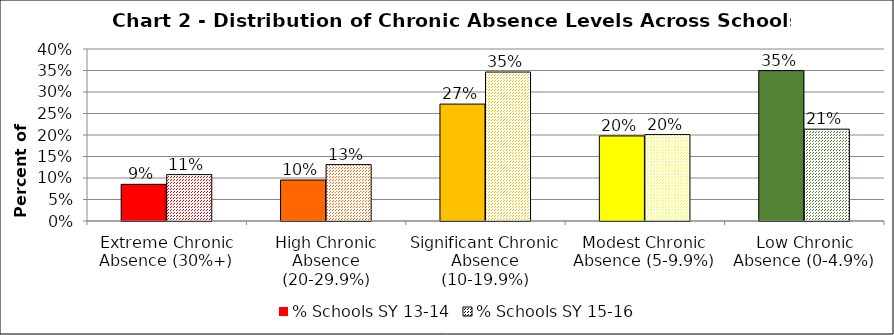
| Category | % Schools SY 13-14 | % Schools SY 15-16 |
|---|---|---|
| Extreme Chronic Absence (30%+) | 0.085 | 0.108 |
| High Chronic Absence (20-29.9%) | 0.095 | 0.131 |
| Significant Chronic Absence (10-19.9%) | 0.272 | 0.346 |
| Modest Chronic Absence (5-9.9%) | 0.198 | 0.201 |
| Low Chronic Absence (0-4.9%) | 0.35 | 0.214 |